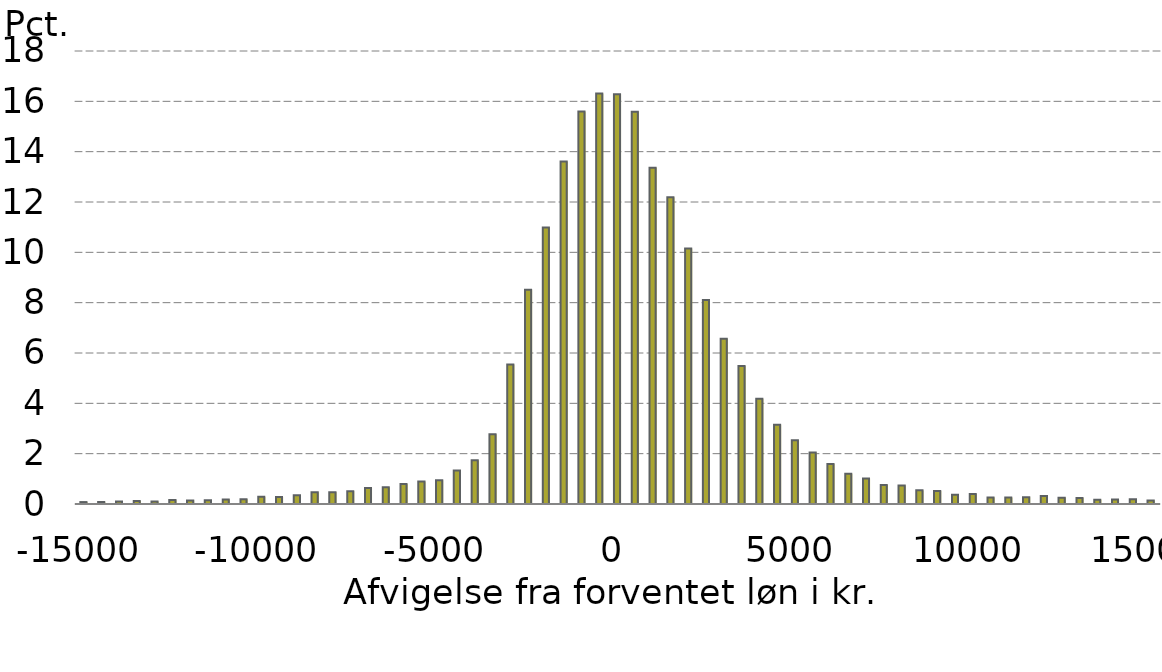
| Category | Series 0 |
|---|---|
| -15000.0 | 0.076 |
| -14500.0 | 0.079 |
| -14000.0 | 0.102 |
| -13500.0 | 0.117 |
| -13000.0 | 0.099 |
| -12500.0 | 0.156 |
| -12000.0 | 0.14 |
| -11500.0 | 0.145 |
| -11000.0 | 0.181 |
| -10500.0 | 0.191 |
| -10000.0 | 0.288 |
| -9500.0 | 0.278 |
| -9000.0 | 0.349 |
| -8500.0 | 0.464 |
| -8000.0 | 0.472 |
| -7500.0 | 0.51 |
| -7000.0 | 0.635 |
| -6500.0 | 0.663 |
| -6000.0 | 0.79 |
| -5500.0 | 0.89 |
| -5000.0 | 0.948 |
| -4500.0 | 1.331 |
| -4000.0 | 1.736 |
| -3500.0 | 2.774 |
| -3000.0 | 5.546 |
| -2500.0 | 8.514 |
| -2000.0 | 10.984 |
| -1500.0 | 13.608 |
| -1000.0 | 15.594 |
| -500.0 | 16.313 |
| 0.0 | 16.277 |
| 500.0 | 15.589 |
| 1000.0 | 13.366 |
| 1500.0 | 12.188 |
| 2000.0 | 10.153 |
| 2500.0 | 8.103 |
| 3000.0 | 6.563 |
| 3500.0 | 5.487 |
| 4000.0 | 4.184 |
| 4500.0 | 3.149 |
| 5000.0 | 2.537 |
| 5500.0 | 2.045 |
| 6000.0 | 1.594 |
| 6500.0 | 1.206 |
| 7000.0 | 1.017 |
| 7500.0 | 0.755 |
| 8000.0 | 0.734 |
| 8500.0 | 0.543 |
| 9000.0 | 0.518 |
| 9500.0 | 0.367 |
| 10000.0 | 0.395 |
| 10500.0 | 0.263 |
| 11000.0 | 0.26 |
| 11500.0 | 0.27 |
| 12000.0 | 0.314 |
| 12500.0 | 0.252 |
| 13000.0 | 0.242 |
| 13500.0 | 0.173 |
| 14000.0 | 0.176 |
| 14500.0 | 0.189 |
| 15000.0 | 0.138 |